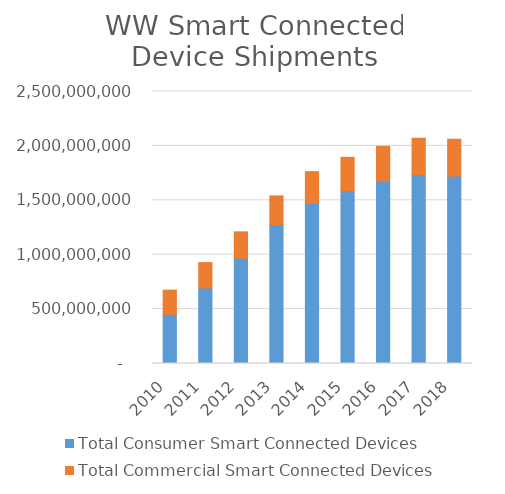
| Category | Total Consumer Smart Connected Devices | Total Commercial Smart Connected Devices |
|---|---|---|
| 2010.0 | 450698527 | 223584937 |
| 2011.0 | 693432504 | 234118656 |
| 2012.0 | 967133548 | 242889390 |
| 2013.0 | 1273668588 | 266750986 |
| 2014.0 | 1472994303 | 290217410 |
| 2015.0 | 1588695487 | 306181300 |
| 2016.0 | 1673661943 | 322505304 |
| 2017.0 | 1736237970 | 334114508 |
| 2018.0 | 1722360326 | 338877612 |